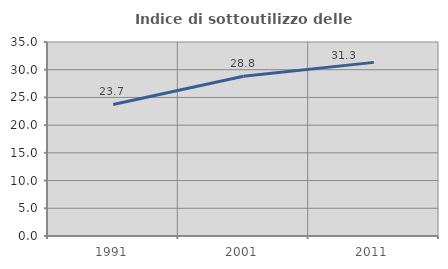
| Category | Indice di sottoutilizzo delle abitazioni  |
|---|---|
| 1991.0 | 23.724 |
| 2001.0 | 28.835 |
| 2011.0 | 31.325 |